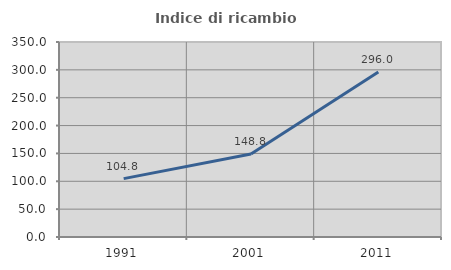
| Category | Indice di ricambio occupazionale  |
|---|---|
| 1991.0 | 104.801 |
| 2001.0 | 148.845 |
| 2011.0 | 296.004 |